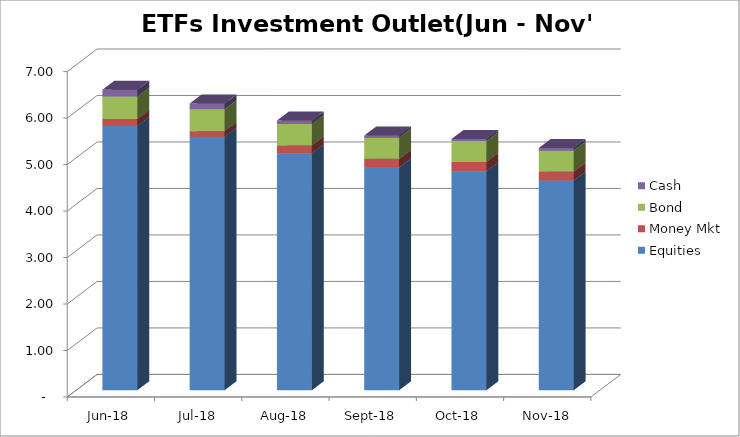
| Category | Equities | Money Mkt | Bond | Cash |
|---|---|---|---|---|
| 2018-06-01 | 5688266618.66 | 146073161.64 | 483544793.6 | 144539302.66 |
| 2018-07-01 | 5450573222.74 | 120602888.23 | 474827704.85 | 119719492.83 |
| 2018-08-01 | 5095492053.52 | 171301483.56 | 457917264.22 | 74763035.01 |
| 2018-09-01 | 4792209737.37 | 184959940.49 | 453943790.42 | 50103376.74 |
| 2018-10-01 | 4710183549.74 | 201812628.7 | 448435810.88 | 45392103.41 |
| 2018-11-01 | 4511471490.81 | 192561506.44 | 449623716.37 | 56722794.06 |